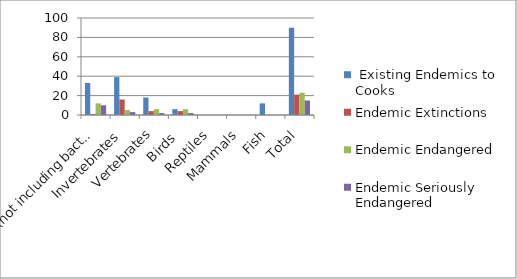
| Category |  Existing Endemics to Cooks | Endemic Extinctions | Endemic Endangered | Endemic Seriously Endangered |
|---|---|---|---|---|
| Plants (not including bacteria or pathogens) | 33 | 1 | 12 | 10 |
| Invertebrates | 39 | 16 | 5 | 3 |
| Vertebrates | 18 | 4 | 6 | 2 |
| Birds  | 6 | 4 | 6 | 2 |
| Reptiles | 0 | 0 | 0 | 0 |
| Mammals | 0 | 0 | 0 | 0 |
| Fish | 12 | 0 | 0 | 0 |
| Total | 90 | 21 | 23 | 15 |